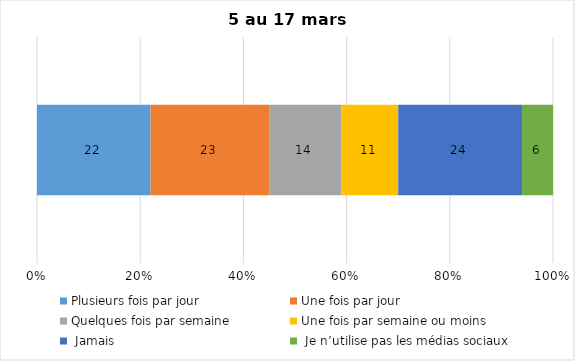
| Category | Plusieurs fois par jour | Une fois par jour | Quelques fois par semaine   | Une fois par semaine ou moins   |  Jamais   |  Je n’utilise pas les médias sociaux |
|---|---|---|---|---|---|---|
| 0 | 22 | 23 | 14 | 11 | 24 | 6 |